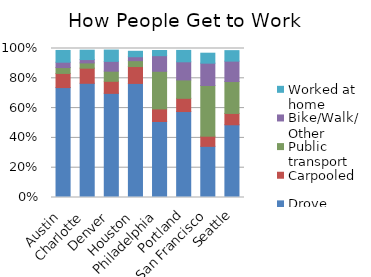
| Category | Drove alone | Carpooled | Public transport | Bike/Walk/Other | Worked at home |
|---|---|---|---|---|---|
| Austin | 0.738 | 0.095 | 0.039 | 0.036 | 0.079 |
| Charlotte | 0.766 | 0.102 | 0.035 | 0.022 | 0.063 |
| Denver | 0.699 | 0.081 | 0.068 | 0.066 | 0.076 |
| Houston | 0.766 | 0.113 | 0.039 | 0.026 | 0.036 |
| Philadelphia | 0.51 | 0.084 | 0.253 | 0.105 | 0.035 |
| Portland | 0.577 | 0.089 | 0.123 | 0.122 | 0.076 |
| San Francisco | 0.343 | 0.068 | 0.34 | 0.15 | 0.067 |
| Seattle | 0.488 | 0.076 | 0.214 | 0.137 | 0.07 |